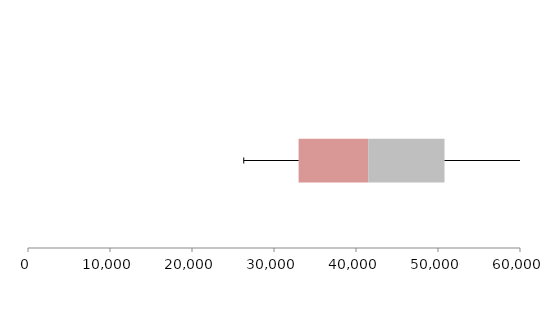
| Category | Series 1 | Series 2 | Series 3 |
|---|---|---|---|
| 0 | 32999.75 | 8486.016 | 9309.276 |